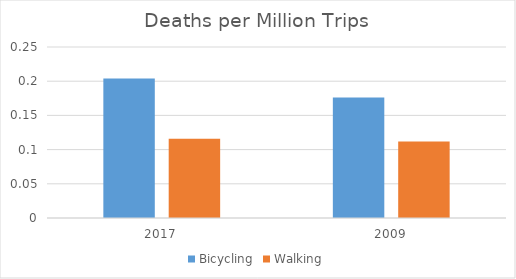
| Category | Bicycling | Walking |
|---|---|---|
| 2017.0 | 0.204 | 0.116 |
| 2009.0 | 0.176 | 0.112 |